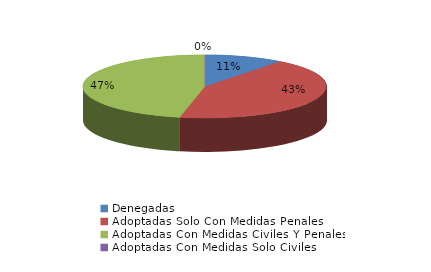
| Category | Series 0 |
|---|---|
| Denegadas | 27 |
| Adoptadas Solo Con Medidas Penales | 110 |
| Adoptadas Con Medidas Civiles Y Penales | 120 |
| Adoptadas Con Medidas Solo Civiles | 0 |